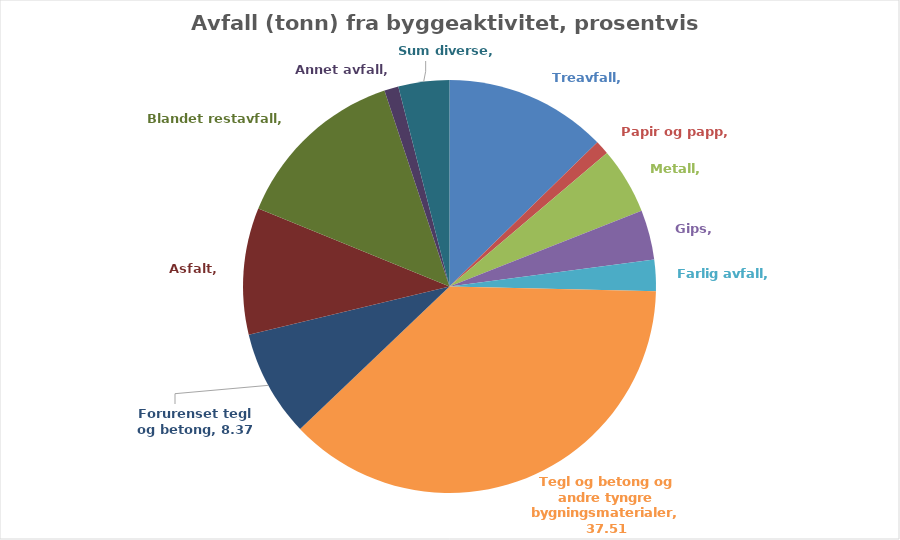
| Category | Series 0 |
|---|---|
| Treavfall | 12.7 |
| Papir og papp | 1.1 |
| Metall | 5.22 |
| Gips | 3.89 |
| Farlig avfall | 2.45 |
| Tegl og betong og andre tyngre bygningsmaterialer | 37.51 |
| Forurenset tegl og betong | 8.37 |
| Asfalt | 9.92 |
| Blandet restavfall | 13.74 |
| Annet avfall | 1.11 |
| Sum diverse | 3.99 |